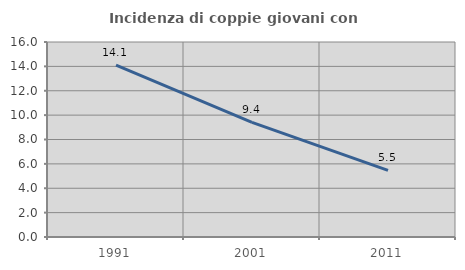
| Category | Incidenza di coppie giovani con figli |
|---|---|
| 1991.0 | 14.107 |
| 2001.0 | 9.405 |
| 2011.0 | 5.462 |